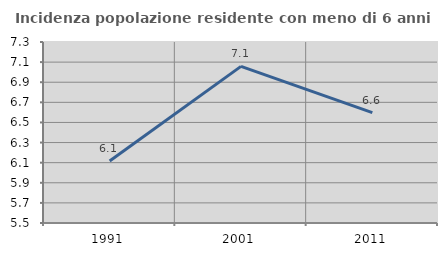
| Category | Incidenza popolazione residente con meno di 6 anni |
|---|---|
| 1991.0 | 6.117 |
| 2001.0 | 7.058 |
| 2011.0 | 6.598 |